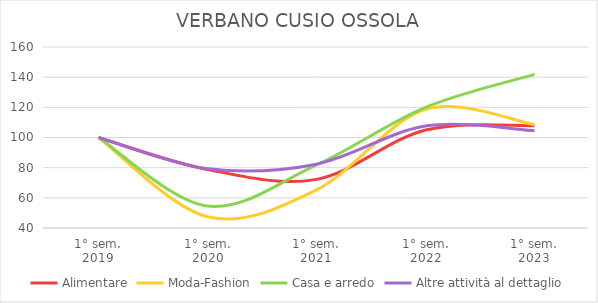
| Category | Alimentare | Moda-Fashion | Casa e arredo | Altre attività al dettaglio |
|---|---|---|---|---|
| 1° sem.
2019 | 100 | 100 | 100 | 100 |
| 1° sem.
2020 | 78.796 | 47.458 | 54.545 | 79.293 |
| 1° sem.
2021 | 72.251 | 65.254 | 81.818 | 82.323 |
| 1° sem.
2022 | 104.974 | 118.644 | 120 | 107.576 |
| 1° sem.
2023 | 107.853 | 108.475 | 141.818 | 104.545 |